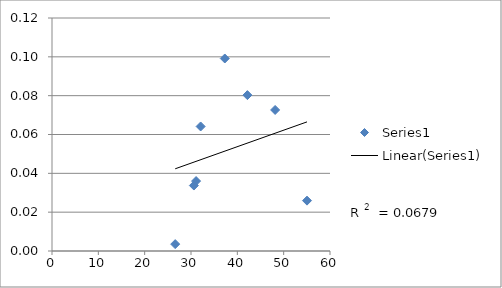
| Category | Series 0 |
|---|---|
| 37.288304841924344 | 0.099 |
| 31.092725658811275 | 0.036 |
| 42.1688577698831 | 0.08 |
| 48.15938306168594 | 0.073 |
| 32.08281674984786 | 0.064 |
| 55.03700745620046 | 0.026 |
| 30.619456563657874 | 0.034 |
| 26.589648385043382 | 0.004 |